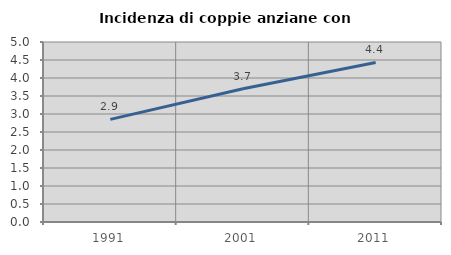
| Category | Incidenza di coppie anziane con figli |
|---|---|
| 1991.0 | 2.85 |
| 2001.0 | 3.704 |
| 2011.0 | 4.433 |